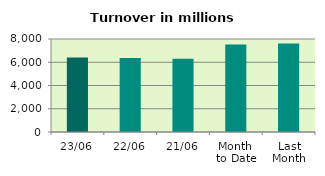
| Category | Series 0 |
|---|---|
| 23/06 | 6405.367 |
| 22/06 | 6357.181 |
| 21/06 | 6295.404 |
| Month 
to Date | 7529.222 |
| Last
Month | 7604.877 |